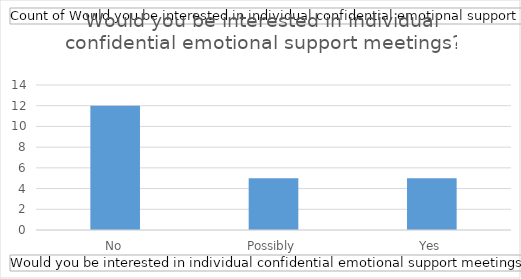
| Category | Total |
|---|---|
| No | 12 |
| Possibly | 5 |
| Yes | 5 |